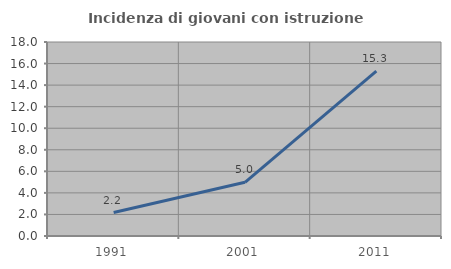
| Category | Incidenza di giovani con istruzione universitaria |
|---|---|
| 1991.0 | 2.18 |
| 2001.0 | 4.981 |
| 2011.0 | 15.297 |